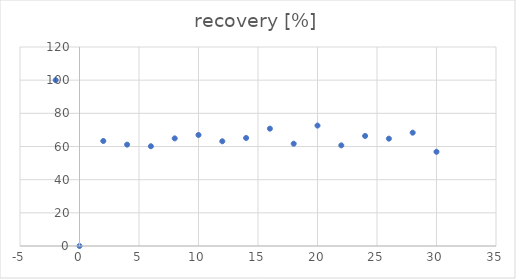
| Category | recovery [%] |
|---|---|
| -2.0 | 100 |
| 0.0 | 0 |
| 2.0 | 63.328 |
| 4.0 | 61.122 |
| 6.0 | 60.151 |
| 8.0 | 64.896 |
| 10.0 | 66.96 |
| 12.0 | 63.146 |
| 14.0 | 65.137 |
| 16.0 | 70.757 |
| 18.0 | 61.678 |
| 20.0 | 72.618 |
| 22.0 | 60.683 |
| 24.0 | 66.354 |
| 26.0 | 64.726 |
| 28.0 | 68.34 |
| 30.0 | 56.824 |